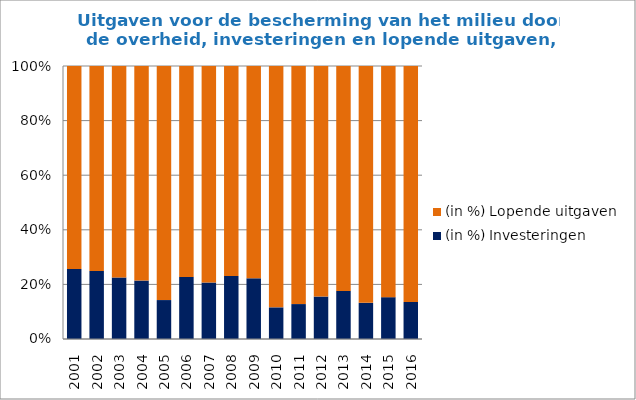
| Category | (in %) |
|---|---|
| 2001 | 74.315 |
| 2002 | 75.123 |
| 2003 | 77.466 |
| 2004 | 78.589 |
| 2005 | 85.742 |
| 2006 | 77.25 |
| 2007 | 79.316 |
| 2008 | 76.926 |
| 2009 | 77.768 |
| 2010 | 88.415 |
| 2011 | 87.212 |
| 2012 | 84.449 |
| 2013 | 82.379 |
| 2014 | 86.745 |
| 2015 | 84.68 |
| 2016 | 86.435 |